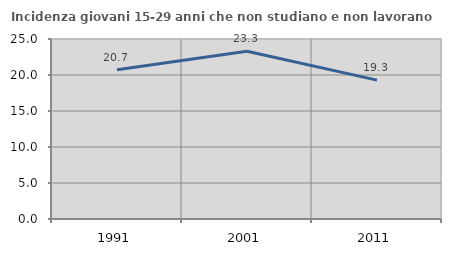
| Category | Incidenza giovani 15-29 anni che non studiano e non lavorano  |
|---|---|
| 1991.0 | 20.741 |
| 2001.0 | 23.297 |
| 2011.0 | 19.288 |